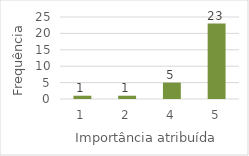
| Category | Series 0 |
|---|---|
| 1.0 | 1 |
| 2.0 | 1 |
| 4.0 | 5 |
| 5.0 | 23 |